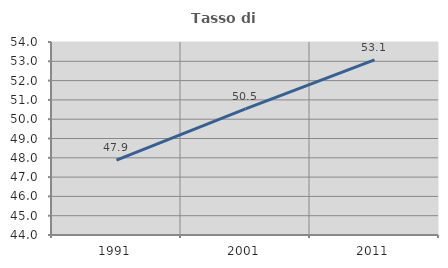
| Category | Tasso di occupazione   |
|---|---|
| 1991.0 | 47.884 |
| 2001.0 | 50.531 |
| 2011.0 | 53.077 |